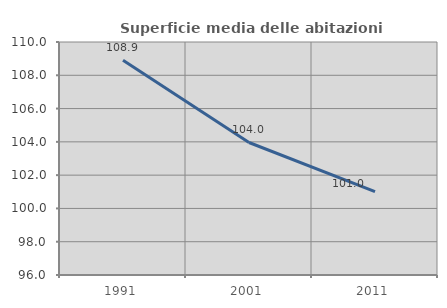
| Category | Superficie media delle abitazioni occupate |
|---|---|
| 1991.0 | 108.899 |
| 2001.0 | 103.961 |
| 2011.0 | 101.015 |